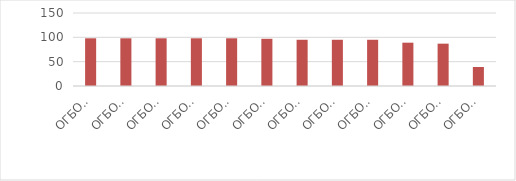
| Category | Series 0 |
|---|---|
| ОГБОУ СПО Ульяновский техникум железнодорожного транспорта | 98 |
| ОГБОУ СПО «Димитровградский техникум строительной индустрии» | 98 |
| ОГБОУ СПО «Димитровградский техникум профессиональных технологий имени Героя Советского Союза М.С.Чернова» | 98 |
| ОГБОУ СПО " Сурский агротехнологический техникум "  | 98 |
| ОГБОУ СПО «Димитровградский механико-технологический колледж молочной промышленности» | 98 |
| ОГБОУ СПО Ульяновский социально-педагогический колледж №1 | 97 |
| ОГБОУ СПО "Ульяновский строительный колледж" | 95 |
| ОГБОУ СПО технологический техникум в р.п. Николаевка  | 95 |
| ОГБОУ СПО технологический техникум р.п.Павловка | 95 |
| ОГБОУ СПО «Карсунский медицинский техникум» | 89 |
| ОГБОУ СПО «Ульяновский электромеханический колледж» | 87 |
| ОГБОУ СПО технологический техникум в р.п.Радищево | 39 |